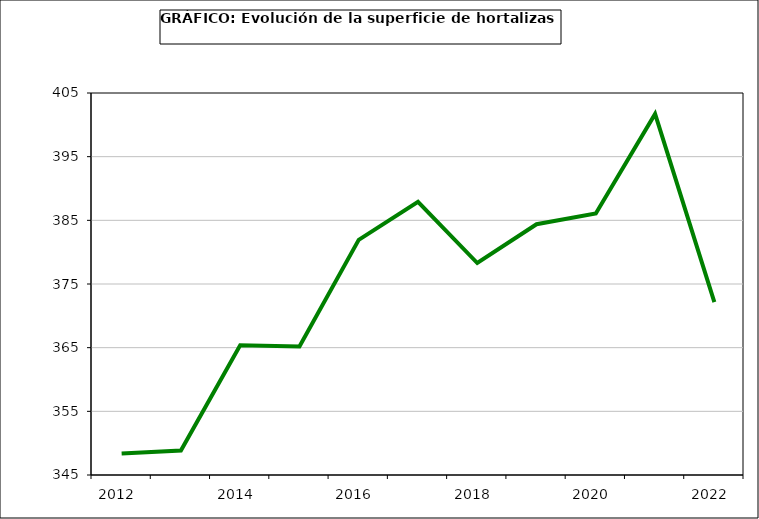
| Category | superficie |
|---|---|
| 2012.0 | 348.359 |
| 2013.0 | 348.853 |
| 2014.0 | 365.385 |
| 2015.0 | 365.178 |
| 2016.0 | 381.94 |
| 2017.0 | 387.895 |
| 2018.0 | 378.294 |
| 2019.0 | 384.392 |
| 2020.0 | 386.084 |
| 2021.0 | 401.711 |
| 2022.0 | 372.159 |